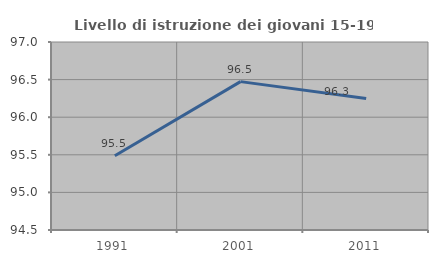
| Category | Livello di istruzione dei giovani 15-19 anni |
|---|---|
| 1991.0 | 95.488 |
| 2001.0 | 96.473 |
| 2011.0 | 96.25 |